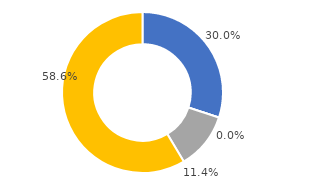
| Category | Series 0 |
|---|---|
| Single-Type | 0.3 |
| Duplex/Quadruplex | 0 |
| Apartment/Accessoria | 0.114 |
| Residential Condominium | 0.586 |